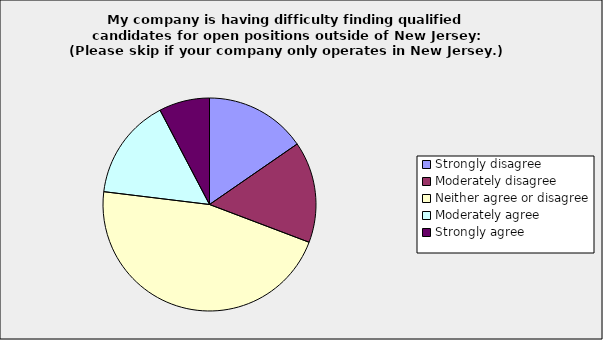
| Category | Series 0 |
|---|---|
| Strongly disagree | 0.154 |
| Moderately disagree | 0.154 |
| Neither agree or disagree | 0.462 |
| Moderately agree | 0.154 |
| Strongly agree | 0.077 |